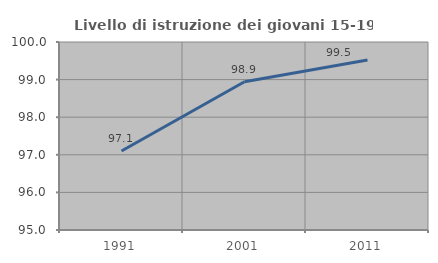
| Category | Livello di istruzione dei giovani 15-19 anni |
|---|---|
| 1991.0 | 97.101 |
| 2001.0 | 98.942 |
| 2011.0 | 99.524 |